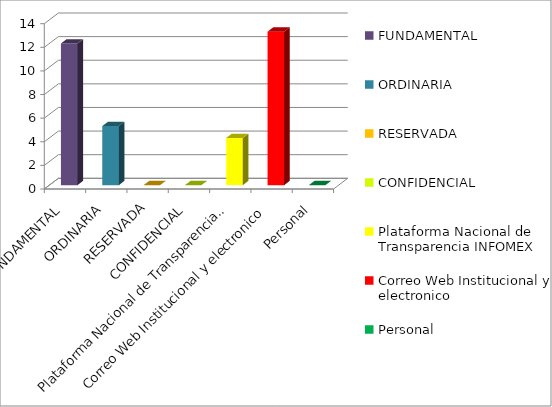
| Category | Series 2 |
|---|---|
| FUNDAMENTAL | 12 |
| ORDINARIA | 5 |
| RESERVADA | 0 |
| CONFIDENCIAL | 0 |
| Plataforma Nacional de Transparencia INFOMEX | 4 |
| Correo Web Institucional y electronico | 13 |
| Personal | 0 |